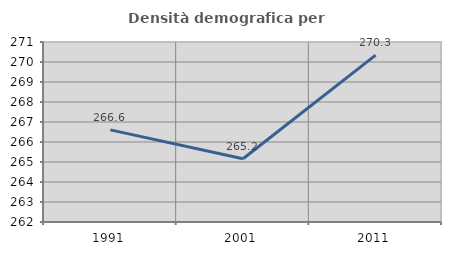
| Category | Densità demografica |
|---|---|
| 1991.0 | 266.605 |
| 2001.0 | 265.161 |
| 2011.0 | 270.344 |